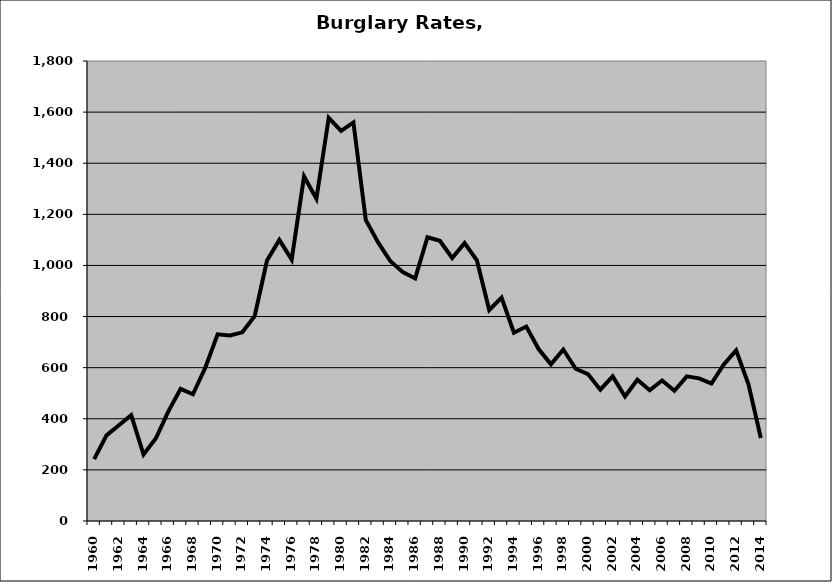
| Category | Burglary |
|---|---|
| 1960.0 | 242.125 |
| 1961.0 | 335.19 |
| 1962.0 | 374.615 |
| 1963.0 | 413.846 |
| 1964.0 | 260.147 |
| 1965.0 | 323.929 |
| 1966.0 | 427.901 |
| 1967.0 | 517.026 |
| 1968.0 | 495.972 |
| 1969.0 | 599.544 |
| 1970.0 | 730.552 |
| 1971.0 | 725.983 |
| 1972.0 | 738.312 |
| 1973.0 | 801.509 |
| 1974.0 | 1019.362 |
| 1975.0 | 1100 |
| 1976.0 | 1022.689 |
| 1977.0 | 1348.24 |
| 1978.0 | 1261.191 |
| 1979.0 | 1577.89 |
| 1980.0 | 1526.7 |
| 1981.0 | 1559.806 |
| 1982.0 | 1178.295 |
| 1983.0 | 1090.286 |
| 1984.0 | 1016.415 |
| 1985.0 | 973.832 |
| 1986.0 | 949.168 |
| 1987.0 | 1110.401 |
| 1988.0 | 1096.763 |
| 1989.0 | 1029.101 |
| 1990.0 | 1087.324 |
| 1991.0 | 1020.106 |
| 1992.0 | 825.614 |
| 1993.0 | 874.306 |
| 1994.0 | 736.897 |
| 1995.0 | 760.855 |
| 1996.0 | 673.005 |
| 1997.0 | 613.073 |
| 1998.0 | 671.066 |
| 1999.0 | 595.715 |
| 2000.0 | 575.04 |
| 2001.0 | 513.885 |
| 2002.0 | 566.021 |
| 2003.0 | 487.129 |
| 2004.0 | 552.933 |
| 2005.0 | 511.739 |
| 2006.0 | 549.6 |
| 2007.0 | 509.614 |
| 2008.0 | 565.978 |
| 2009.0 | 558.254 |
| 2010.0 | 537.922 |
| 2011.0 | 612.52 |
| 2012.0 | 667.622 |
| 2013.0 | 534.733 |
| 2014.0 | 324.629 |